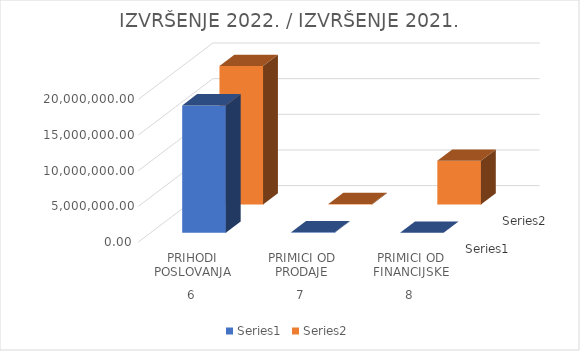
| Category | Series 0 | Series 1 |
|---|---|---|
| 0 | 17858075 | 19426020.68 |
| 1 | 66504 | 84716.5 |
| 2 | 0 | 6147612.41 |